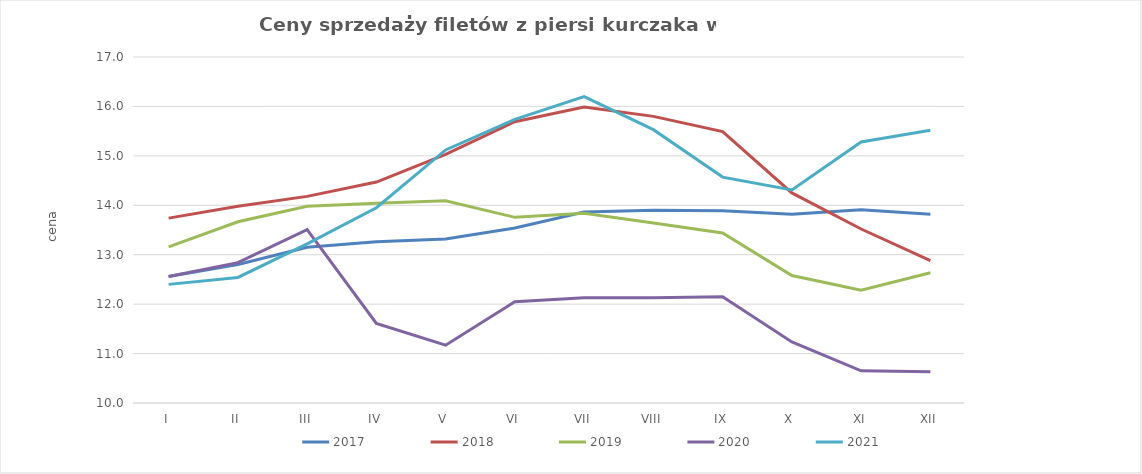
| Category | 2017 | 2018 | 2019 | 2020 | 2021 |
|---|---|---|---|---|---|
| I | 12.56 | 13.74 | 13.16 | 12.56 | 12.4 |
| II | 12.801 | 13.98 | 13.666 | 12.84 | 12.54 |
| III | 13.15 | 14.18 | 13.98 | 13.507 | 13.22 |
| IV | 13.26 | 14.47 | 14.04 | 11.61 | 13.95 |
| V | 13.32 | 15.03 | 14.09 | 11.17 | 15.12 |
| VI | 13.54 | 15.69 | 13.756 | 12.05 | 15.74 |
| VII | 13.862 | 15.99 | 13.84 | 12.13 | 16.2 |
| VIII | 13.9 | 15.799 | 13.64 | 12.13 | 15.53 |
| IX | 13.89 | 15.49 | 13.44 | 12.15 | 14.57 |
| X | 13.82 | 14.25 | 12.58 | 11.235 | 14.31 |
| XI | 13.91 | 13.52 | 12.28 | 10.65 | 15.28 |
| XII | 13.82 | 12.88 | 12.635 | 10.63 | 15.52 |